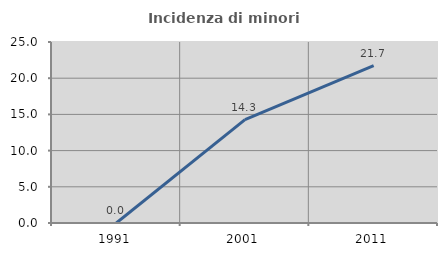
| Category | Incidenza di minori stranieri |
|---|---|
| 1991.0 | 0 |
| 2001.0 | 14.286 |
| 2011.0 | 21.739 |